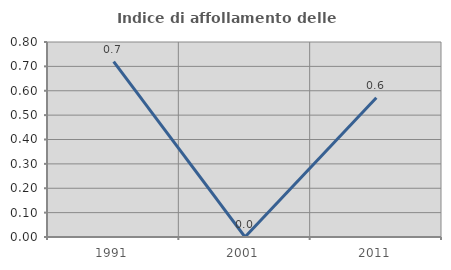
| Category | Indice di affollamento delle abitazioni  |
|---|---|
| 1991.0 | 0.719 |
| 2001.0 | 0 |
| 2011.0 | 0.571 |